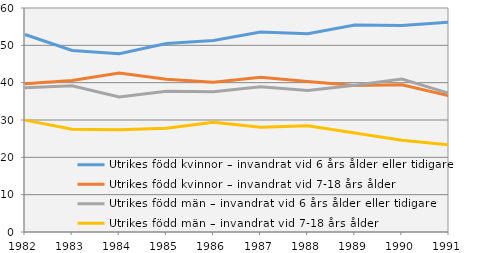
| Category | Utrikes född kvinnor – invandrat vid 6 års ålder eller tidigare | Utrikes född kvinnor – invandrat vid 7-18 års ålder | Utrikes född män – invandrat vid 6 års ålder eller tidigare | Utrikes född män – invandrat vid 7-18 års ålder |
|---|---|---|---|---|
| 1982.0 | 52.905 | 39.7 | 38.67 | 29.961 |
| 1983.0 | 48.609 | 40.578 | 39.18 | 27.55 |
| 1984.0 | 47.772 | 42.579 | 36.195 | 27.4 |
| 1985.0 | 50.481 | 40.896 | 37.679 | 27.778 |
| 1986.0 | 51.29 | 40.095 | 37.584 | 29.407 |
| 1987.0 | 53.594 | 41.445 | 38.917 | 28.057 |
| 1988.0 | 53.115 | 40.303 | 37.879 | 28.482 |
| 1989.0 | 55.433 | 39.244 | 39.335 | 26.538 |
| 1990.0 | 55.33 | 39.456 | 40.991 | 24.575 |
| 1991.0 | 56.231 | 36.508 | 37.137 | 23.334 |